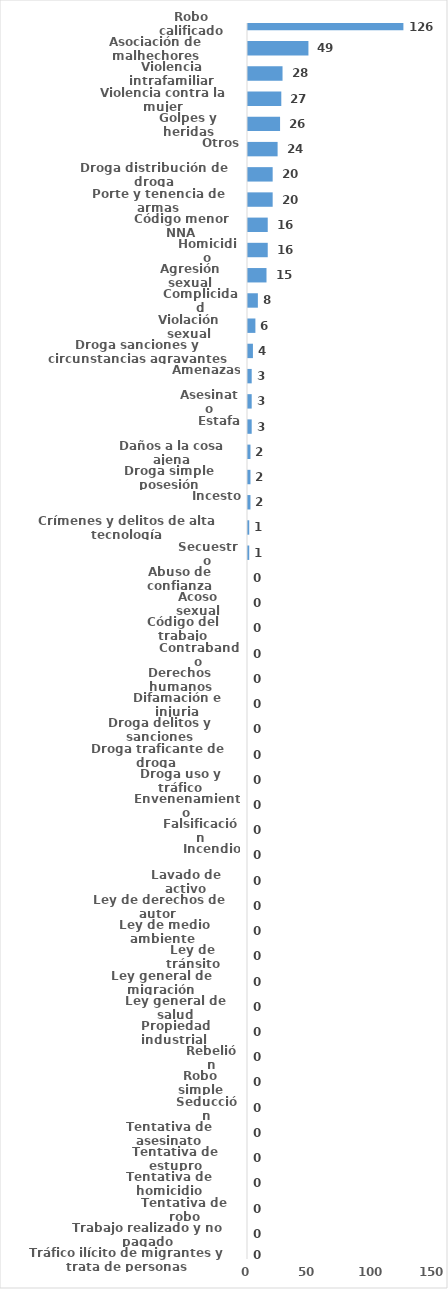
| Category | Series 0 |
|---|---|
| Robo calificado | 126 |
| Asociación de malhechores | 49 |
| Violencia intrafamiliar | 28 |
| Violencia contra la mujer | 27 |
| Golpes y heridas | 26 |
| Otros | 24 |
| Droga distribución de droga | 20 |
| Porte y tenencia de armas | 20 |
| Código menor NNA | 16 |
| Homicidio | 16 |
| Agresión sexual | 15 |
| Complicidad | 8 |
| Violación sexual | 6 |
| Droga sanciones y circunstancias agravantes | 4 |
| Amenazas | 3 |
| Asesinato | 3 |
| Estafa | 3 |
| Daños a la cosa ajena | 2 |
| Droga simple posesión | 2 |
| Incesto | 2 |
| Crímenes y delitos de alta tecnología | 1 |
| Secuestro | 1 |
| Abuso de confianza | 0 |
| Acoso sexual | 0 |
| Código del trabajo | 0 |
| Contrabando | 0 |
| Derechos humanos | 0 |
| Difamación e injuria | 0 |
| Droga delitos y sanciones | 0 |
| Droga traficante de droga  | 0 |
| Droga uso y tráfico | 0 |
| Envenenamiento | 0 |
| Falsificación | 0 |
| Incendio | 0 |
| Lavado de activo | 0 |
| Ley de derechos de autor  | 0 |
| Ley de medio ambiente  | 0 |
| Ley de tránsito | 0 |
| Ley general de migración | 0 |
| Ley general de salud | 0 |
| Propiedad industrial  | 0 |
| Rebelión | 0 |
| Robo simple | 0 |
| Seducción | 0 |
| Tentativa de asesinato | 0 |
| Tentativa de estupro | 0 |
| Tentativa de homicidio | 0 |
| Tentativa de robo | 0 |
| Trabajo realizado y no pagado | 0 |
| Tráfico ilícito de migrantes y trata de personas | 0 |